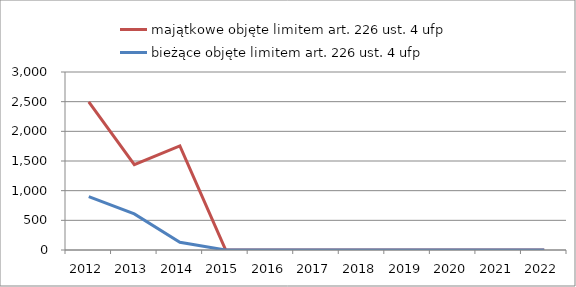
| Category | majątkowe objęte limitem art. 226 ust. 4 ufp | bieżące objęte limitem art. 226 ust. 4 ufp |
|---|---|---|
| 2012.0 | 2495502 | 899105 |
| 2013.0 | 1439667 | 608231 |
| 2014.0 | 1755304 | 130642 |
| 2015.0 | 10456 | 0 |
| 2016.0 | 0 | 0 |
| 2017.0 | 0 | 0 |
| 2018.0 | 0 | 0 |
| 2019.0 | 0 | 0 |
| 2020.0 | 0 | 0 |
| 2021.0 | 0 | 0 |
| 2022.0 | 0 | 0 |